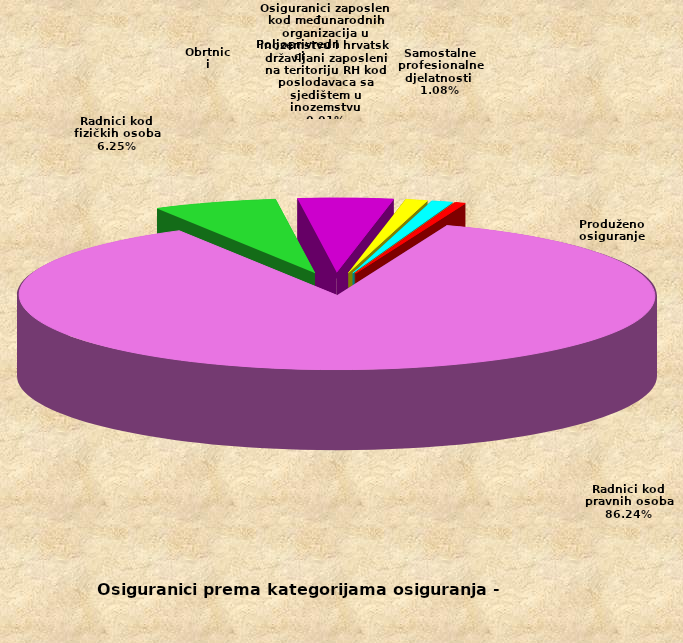
| Category | Series 0 |
|---|---|
| Radnici kod pravnih osoba | 1421966 |
| Radnici kod fizičkih osoba | 103017 |
| Obrtnici | 79249 |
| Poljoprivrednici | 18370 |
| Samostalne profesionalne djelatnosti  | 17726 |
| Osiguranici zaposleni kod međunarodnih organizacija u inozemstvu i hrvatski državljani zaposleni na teritoriju RH kod poslodavaca sa sjedištem u inozemstvu | 170 |
| Produženo osiguranje | 8379 |